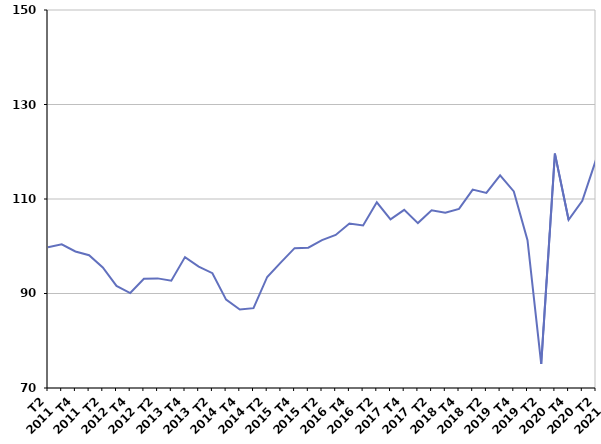
| Category | Reprise d'emploi déclarée |
|---|---|
| T2
2011 | 99.8 |
| T3
2011 | 100.4 |
| T4
2011 | 98.9 |
| T1
2012 | 98.1 |
| T2
2012 | 95.5 |
| T3
2012 | 91.6 |
| T4
2012 | 90.1 |
| T1
2013 | 93.1 |
| T2
2013 | 93.2 |
| T3
2013 | 92.7 |
| T4
2013 | 97.7 |
| T1
2014 | 95.7 |
| T2
2014 | 94.3 |
| T3
2014 | 88.7 |
| T4
2014 | 86.6 |
| T1
2015 | 86.9 |
| T2
2015 | 93.5 |
| T3
2015 | 96.6 |
| T4
2015 | 99.6 |
| T1
2016 | 99.7 |
| T2
2016 | 101.3 |
| T3
2016 | 102.4 |
| T4
2016 | 104.8 |
| T1
2017 | 104.4 |
| T2
2017 | 109.3 |
| T3
2017 | 105.7 |
| T4
2017 | 107.7 |
| T1
2018 | 104.9 |
| T2
2018 | 107.6 |
| T3
2018 | 107.1 |
| T4
2018 | 107.9 |
| T1
2019 | 112 |
| T2
2019 | 111.3 |
| T3
2019 | 115 |
| T4
2019 | 111.6 |
| T1
2020 | 101.3 |
| T2
2020 | 75.1 |
| T3
2020 | 119.6 |
| T4
2020 | 105.6 |
| T1
2021 | 109.6 |
| T2
2021 | 118.3 |